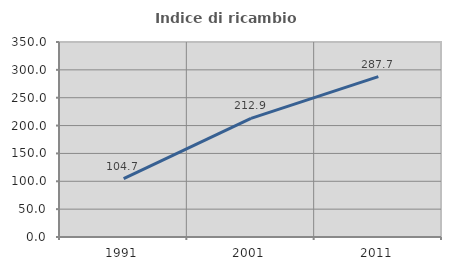
| Category | Indice di ricambio occupazionale  |
|---|---|
| 1991.0 | 104.737 |
| 2001.0 | 212.889 |
| 2011.0 | 287.736 |